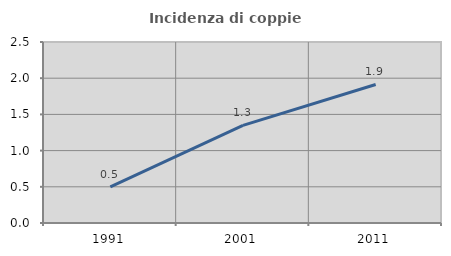
| Category | Incidenza di coppie miste |
|---|---|
| 1991.0 | 0.498 |
| 2001.0 | 1.349 |
| 2011.0 | 1.914 |